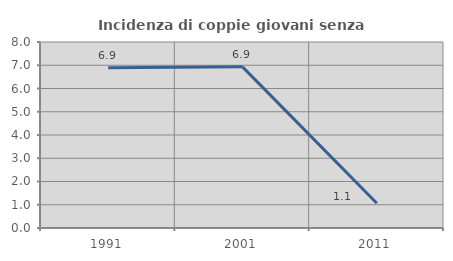
| Category | Incidenza di coppie giovani senza figli |
|---|---|
| 1991.0 | 6.897 |
| 2001.0 | 6.931 |
| 2011.0 | 1.064 |